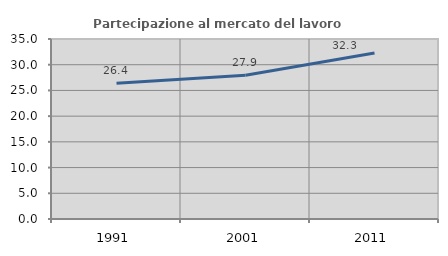
| Category | Partecipazione al mercato del lavoro  femminile |
|---|---|
| 1991.0 | 26.413 |
| 2001.0 | 27.947 |
| 2011.0 | 32.292 |